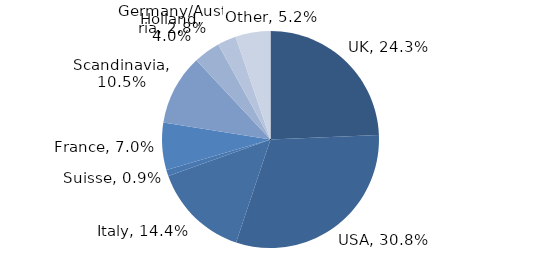
| Category | Investment Style |
|---|---|
| UK | 0.243 |
| USA | 0.308 |
| Italy | 0.144 |
| Suisse | 0.009 |
| France | 0.07 |
| Scandinavia | 0.105 |
| Holland | 0.04 |
| Germany/Austria | 0.028 |
| Other | 0.052 |